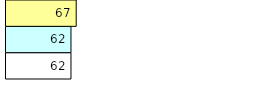
| Category | Total Standouts | Total Recd | Total Tipsters |
|---|---|---|---|
| 0 | 62 | 62 | 67 |